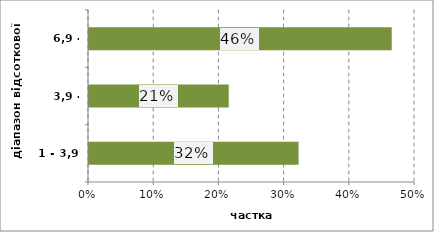
| Category | Series 0 |
|---|---|
| 1 - 3,9 | 0.321 |
| 3,9 - 6,9 | 0.214 |
| 6,9 - 9,8 | 0.464 |